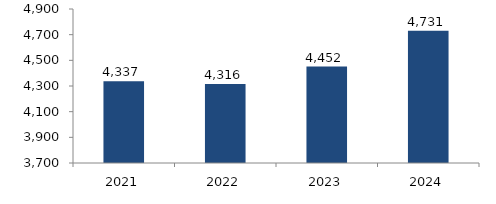
| Category | Bogotá |
|---|---|
| 2021.0 | 4337.188 |
| 2022.0 | 4315.602 |
| 2023.0 | 4451.764 |
| 2024.0 | 4731.273 |